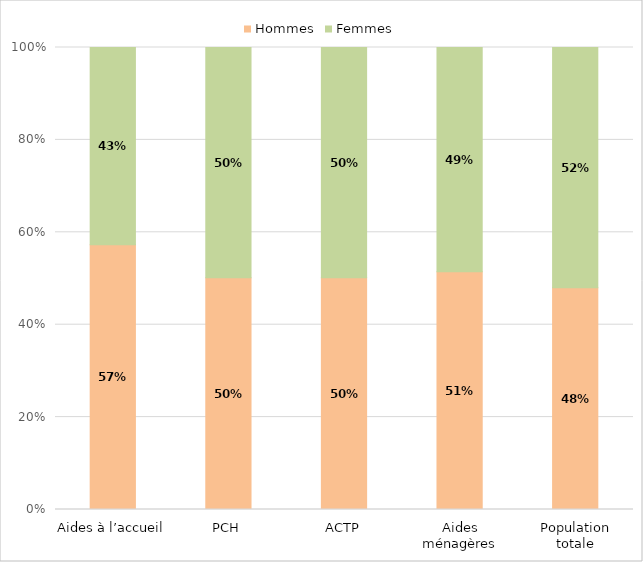
| Category | Hommes | Femmes |
|---|---|---|
| 0 | 0.573 | 0.427 |
| 1 | 0.502 | 0.498 |
| 2 | 0.502 | 0.498 |
| 3 | 0.515 | 0.485 |
| 4 | 0.48 | 0.52 |